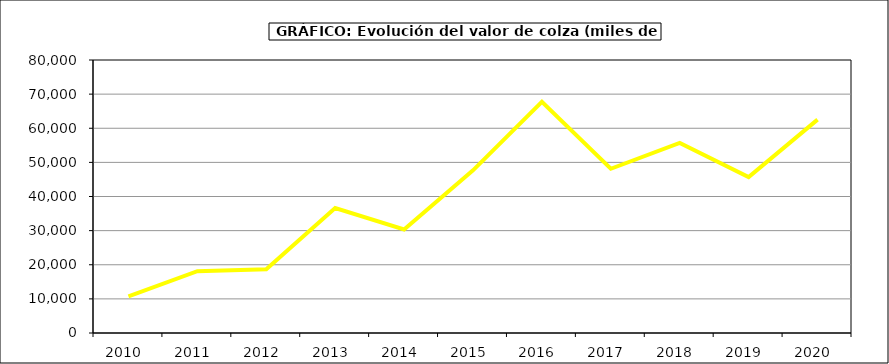
| Category | Valor |
|---|---|
| 2010.0 | 10697.01 |
| 2011.0 | 18103.437 |
| 2012.0 | 18685.071 |
| 2013.0 | 36622.55 |
| 2014.0 | 30337.743 |
| 2015.0 | 47668.761 |
| 2016.0 | 67774.665 |
| 2017.0 | 48127.878 |
| 2018.0 | 55705.935 |
| 2019.0 | 45692.921 |
| 2020.0 | 62535.859 |